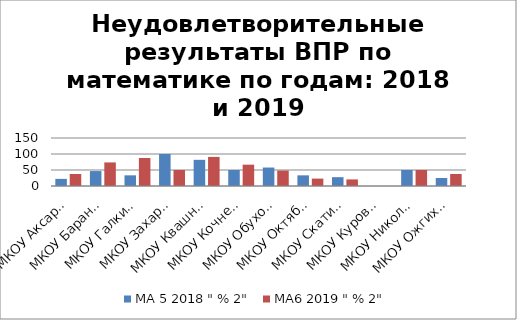
| Category | МА 5 2018 " % 2" | МА6 2019 " % 2" |
|---|---|---|
| МКОУ Аксарихинская СОШ | 22.222 | 37.5 |
| МКОУ Баранниковская СОШ | 46.667 | 73.684 |
| МКОУ Галкиинская СОШ | 33.333 | 87.5 |
| МКОУ Захаровская СОШ | 100 | 50 |
| МКОУ Квашнинская СОШ | 81.818 | 90.909 |
| МКОУ Кочневская СОШ | 50 | 66.667 |
| МКОУ Обуховская СОШ | 57.692 | 48.276 |
| МКОУ Октябрьская СОШ | 33.333 | 23.077 |
| МКОУ Скатинская СОШ | 27.586 | 20.588 |
| МКОУ Куровская ООШ | 0 | 0 |
| МКОУ Никольская ООШ | 50 | 50 |
| МКОУ Ожгихинская ООШ | 25 | 37.5 |